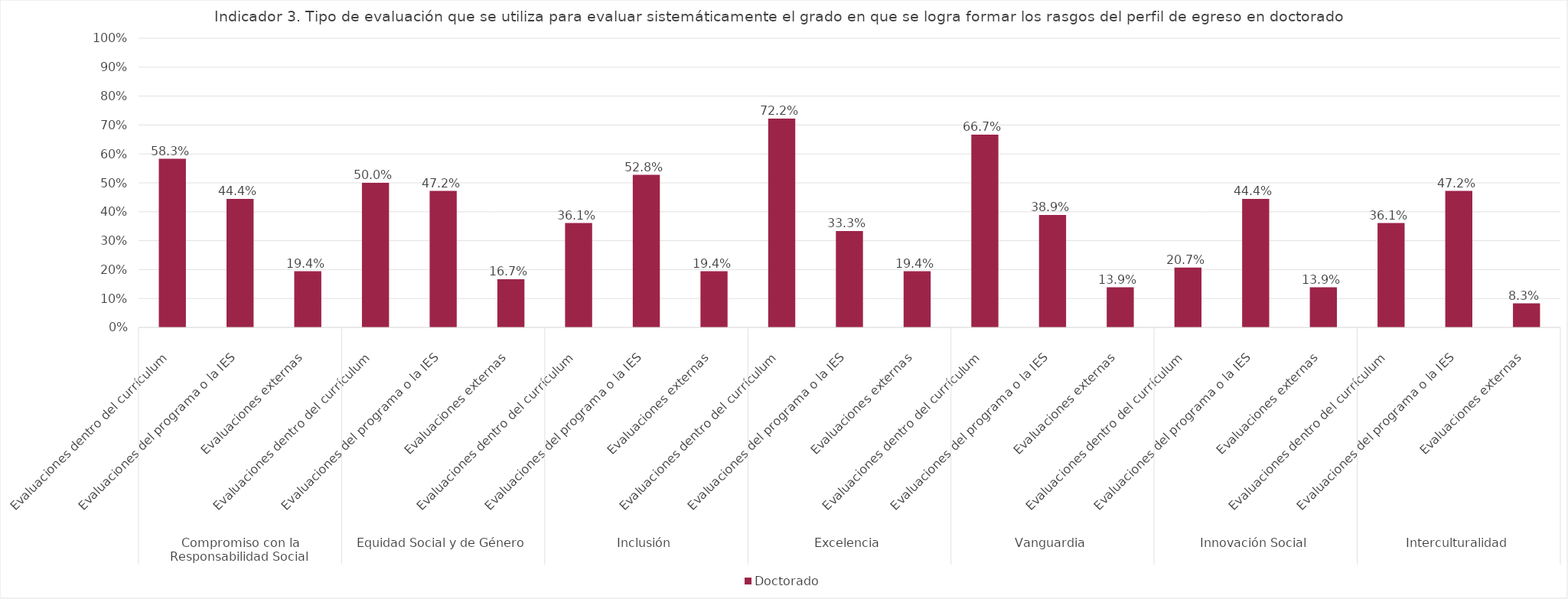
| Category | Doctorado |
|---|---|
| 0 | 0.583 |
| 1 | 0.444 |
| 2 | 0.194 |
| 3 | 0.5 |
| 4 | 0.472 |
| 5 | 0.167 |
| 6 | 0.361 |
| 7 | 0.528 |
| 8 | 0.194 |
| 9 | 0.722 |
| 10 | 0.333 |
| 11 | 0.194 |
| 12 | 0.667 |
| 13 | 0.389 |
| 14 | 0.139 |
| 15 | 0.207 |
| 16 | 0.444 |
| 17 | 0.139 |
| 18 | 0.361 |
| 19 | 0.472 |
| 20 | 0.083 |